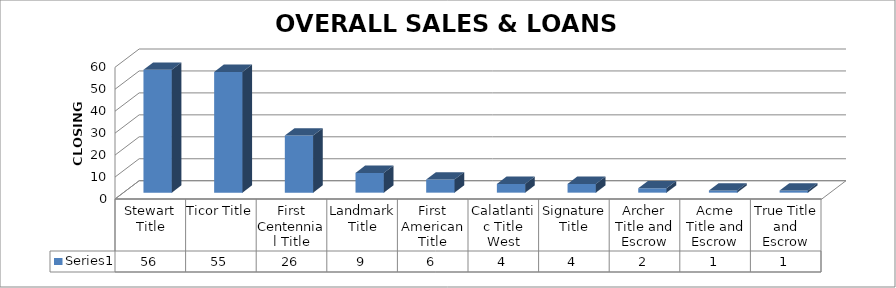
| Category | Series 0 |
|---|---|
| Stewart Title | 56 |
| Ticor Title | 55 |
| First Centennial Title | 26 |
| Landmark Title | 9 |
| First American Title | 6 |
| Calatlantic Title West | 4 |
| Signature Title | 4 |
| Archer Title and Escrow | 2 |
| Acme Title and Escrow | 1 |
| True Title and Escrow | 1 |